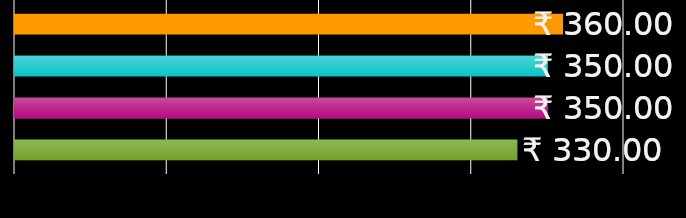
| Category | कक्ष साथी 1 | कक्ष साथी 2 | कक्ष साथी 3 | कक्ष साथी 4 |
|---|---|---|---|---|
| 0 | 360 | 350 | 350 | 330 |